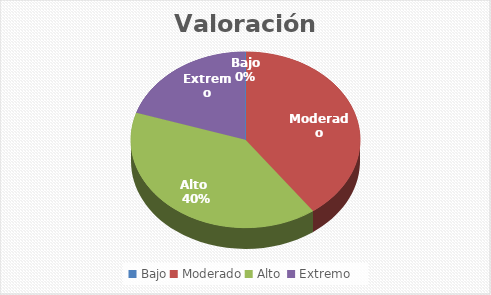
| Category | Valoración Inherente |
|---|---|
| Bajo | 0 |
| Moderado | 4 |
| Alto  | 4 |
| Extremo | 2 |